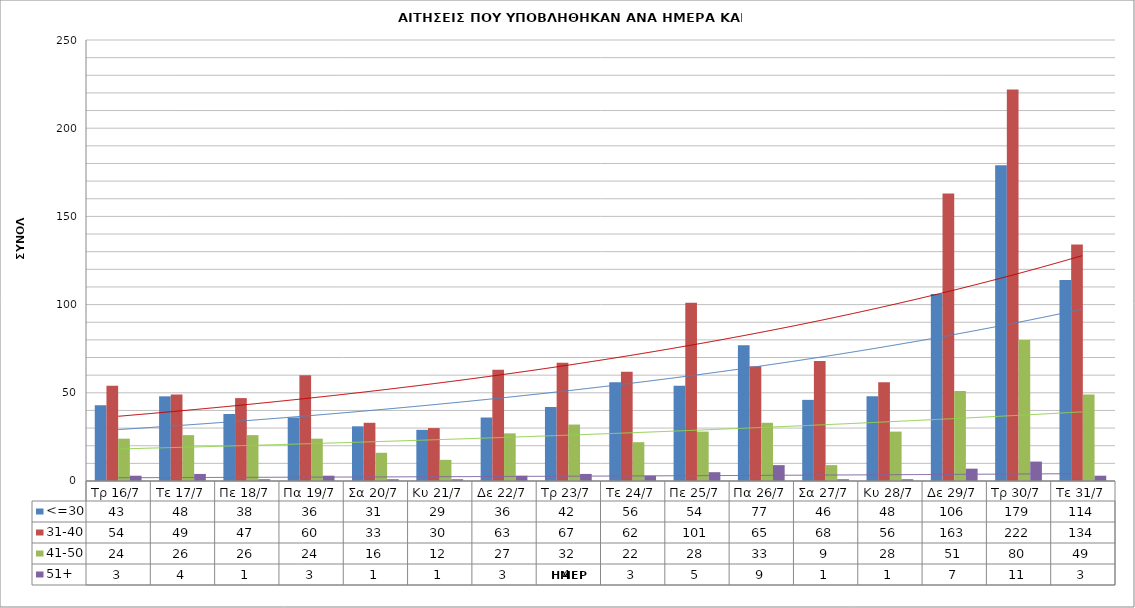
| Category | <=30 | 31-40 | 41-50 | 51+ |
|---|---|---|---|---|
| Τρ 16/7 | 43 | 54 | 24 | 3 |
| Τε 17/7 | 48 | 49 | 26 | 4 |
| Πε 18/7 | 38 | 47 | 26 | 1 |
| Πα 19/7 | 36 | 60 | 24 | 3 |
| Σα 20/7 | 31 | 33 | 16 | 1 |
| Κυ 21/7 | 29 | 30 | 12 | 1 |
| Δε 22/7 | 36 | 63 | 27 | 3 |
| Τρ 23/7 | 42 | 67 | 32 | 4 |
| Τε 24/7 | 56 | 62 | 22 | 3 |
| Πε 25/7 | 54 | 101 | 28 | 5 |
| Πα 26/7 | 77 | 65 | 33 | 9 |
| Σα 27/7 | 46 | 68 | 9 | 1 |
| Κυ 28/7 | 48 | 56 | 28 | 1 |
| Δε 29/7 | 106 | 163 | 51 | 7 |
| Τρ 30/7 | 179 | 222 | 80 | 11 |
| Τε 31/7 | 114 | 134 | 49 | 3 |